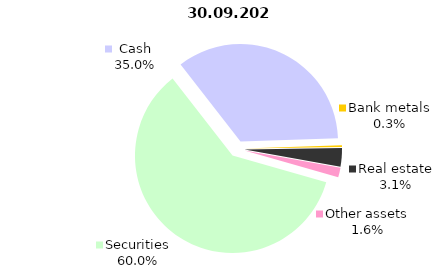
| Category | 30.09.2021 |
|---|---|
| Securities | 2273.735 |
| Cash | 1326.223 |
| Bank metals | 10.307 |
| Real estate | 116.085 |
| Other assets | 61.831 |